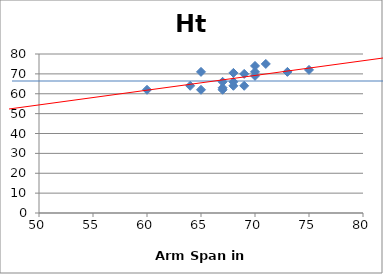
| Category | Ht (in) |
|---|---|
| 60.0 | 62 |
| 68.0 | 64 |
| 68.0 | 70.5 |
| 69.0 | 70 |
| 75.0 | 72 |
| 64.0 | 64 |
| 67.0 | 62 |
| 67.0 | 66 |
| 70.0 | 74 |
| 69.0 | 64 |
| 73.0 | 71 |
| 65.0 | 62 |
| 70.0 | 71 |
| 70.0 | 69 |
| 71.0 | 75 |
| 68.0 | 66 |
| 65.0 | 71 |
| 67.0 | 63 |